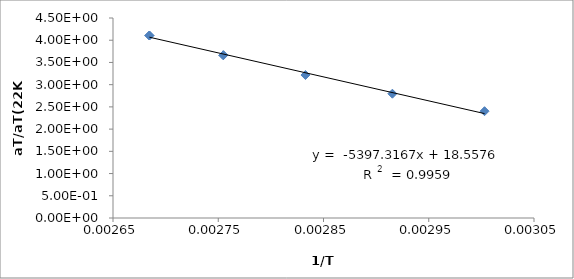
| Category | Series 0 |
|---|---|
| 0.003003003003003 | 2.403 |
| 0.00291545189504373 | 2.797 |
| 0.0028328611898017 | 3.217 |
| 0.00275482093663912 | 3.662 |
| 0.00275482093663912 | 3.662 |
| 0.00268456375838926 | 4.106 |
| 0.00268456375838926 | 4.106 |